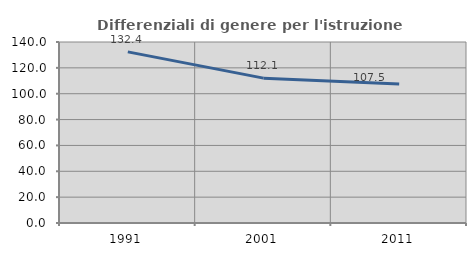
| Category | Differenziali di genere per l'istruzione superiore |
|---|---|
| 1991.0 | 132.366 |
| 2001.0 | 112.054 |
| 2011.0 | 107.472 |